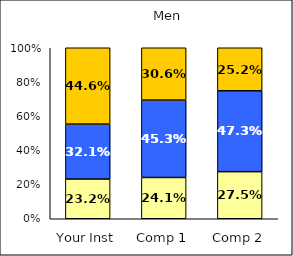
| Category | Low Career Related Stress | Average Career Related Stress | High Career Related Stress |
|---|---|---|---|
| Your Inst | 0.232 | 0.321 | 0.446 |
| Comp 1 | 0.241 | 0.453 | 0.306 |
| Comp 2 | 0.275 | 0.473 | 0.252 |